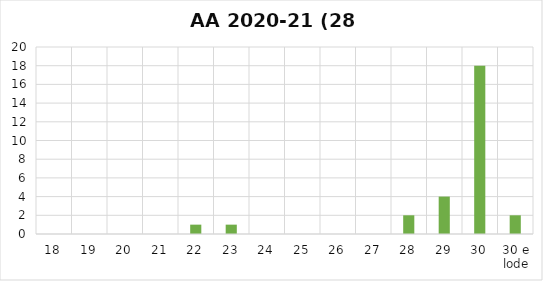
| Category | Series 0 |
|---|---|
| 18 | 0 |
| 19 | 0 |
| 20 | 0 |
| 21 | 0 |
| 22 | 1 |
| 23 | 1 |
| 24 | 0 |
| 25 | 0 |
| 26 | 0 |
| 27 | 0 |
| 28 | 2 |
| 29 | 4 |
| 30 | 18 |
| 30 e lode | 2 |